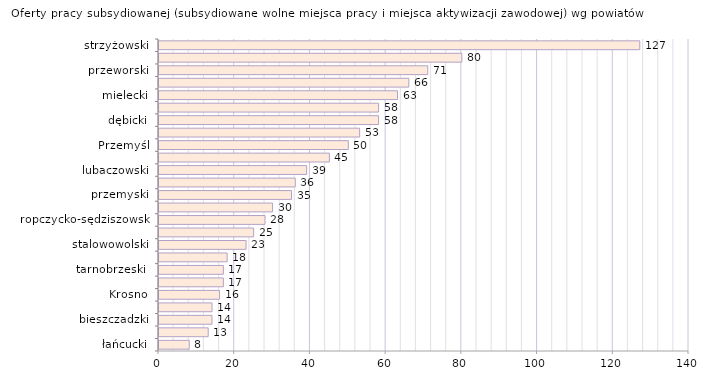
| Category | Oferty pracy subsydiowanej (subsydiowane wolne miejsca pracy i miejsca aktywizacji zawodowej) wg powiatów |
|---|---|
| łańcucki | 8 |
| Tarnobrzeg | 13 |
| bieszczadzki | 14 |
| leski | 14 |
| Krosno | 16 |
| jarosławski | 17 |
| tarnobrzeski  | 17 |
| leżajski | 18 |
| stalowowolski | 23 |
| rzeszowski | 25 |
| ropczycko-sędziszowski | 28 |
| krośnieński | 30 |
| przemyski | 35 |
| kolbuszowski | 36 |
| lubaczowski | 39 |
| sanocki | 45 |
| Przemyśl | 50 |
| Rzeszów | 53 |
| dębicki | 58 |
| niżański | 58 |
| mielecki | 63 |
| brzozowski | 66 |
| przeworski | 71 |
| jasielski | 80 |
| strzyżowski | 127 |